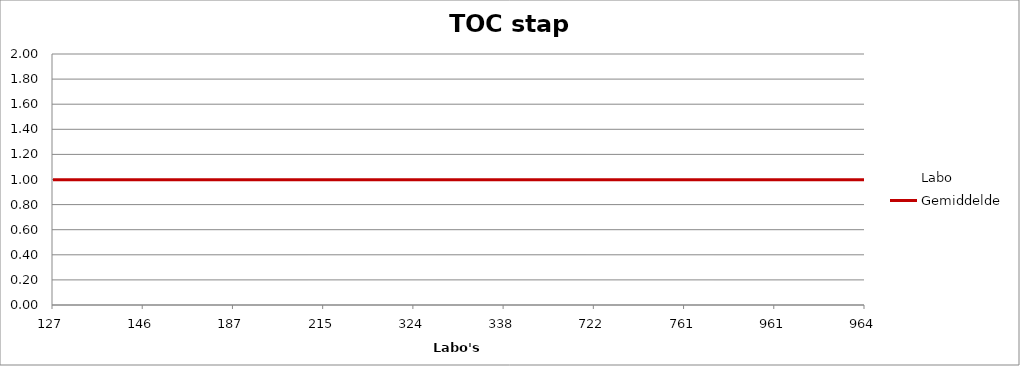
| Category | Labo  | Gemiddelde |
|---|---|---|
| 127.0 | 0.948 | 0.999 |
| 146.0 | 0.975 | 0.999 |
| 187.0 | 1.019 | 0.999 |
| 215.0 | 0.999 | 0.999 |
| 324.0 | 1.017 | 0.999 |
| 338.0 | 1.888 | 0.999 |
| 722.0 | 1.049 | 0.999 |
| 761.0 | 1.016 | 0.999 |
| 961.0 | 0.963 | 0.999 |
| 964.0 | 1.005 | 0.999 |